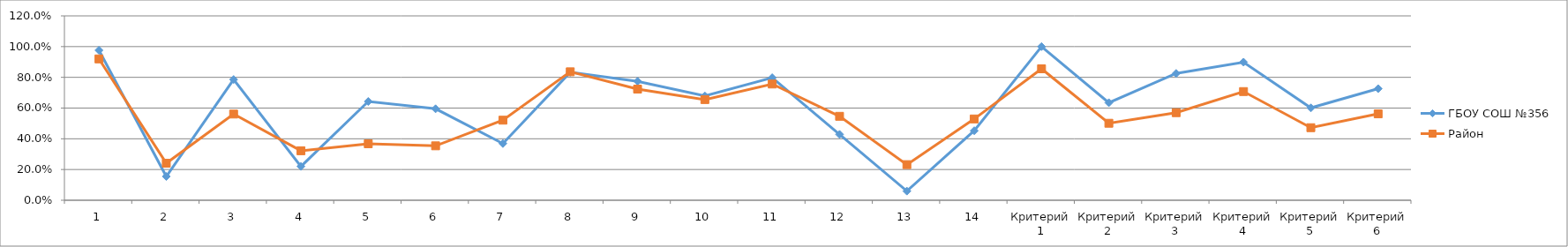
| Category | ГБОУ СОШ №356 | Район |
|---|---|---|
| 1 | 0.976 | 0.92 |
| 2 | 0.155 | 0.241 |
| 3 | 0.786 | 0.561 |
| 4 | 0.22 | 0.322 |
| 5 | 0.643 | 0.368 |
| 6 | 0.595 | 0.354 |
| 7 | 0.369 | 0.521 |
| 8 | 0.833 | 0.836 |
| 9 | 0.774 | 0.723 |
| 10 | 0.679 | 0.655 |
| 11 | 0.798 | 0.756 |
| 12 | 0.429 | 0.546 |
| 13 | 0.06 | 0.232 |
| 14 | 0.452 | 0.529 |
| Критерий 1 | 1 | 0.855 |
| Критерий 2 | 0.635 | 0.501 |
| Критерий 3 | 0.825 | 0.57 |
| Критерий 4 | 0.899 | 0.707 |
| Критерий 5 | 0.601 | 0.472 |
| Критерий 6 | 0.726 | 0.562 |